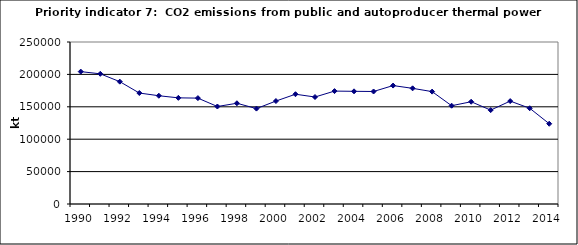
| Category | CO2 emissions from public and autoproducer thermal power stations, kt |
|---|---|
| 1990 | 204305.032 |
| 1991 | 200900.46 |
| 1992 | 188795.28 |
| 1993 | 171261.364 |
| 1994 | 167067.753 |
| 1995 | 163801.166 |
| 1996 | 163391.328 |
| 1997 | 150441.281 |
| 1998 | 155465.546 |
| 1999 | 147230.874 |
| 2000 | 158884.343 |
| 2001 | 169404.807 |
| 2002 | 165103.357 |
| 2003 | 174253.292 |
| 2004 | 173876.806 |
| 2005 | 173626.348 |
| 2006 | 182759.951 |
| 2007 | 178497.017 |
| 2008 | 173437.001 |
| 2009 | 151684.17 |
| 2010 | 157798.086 |
| 2011 | 144916.149 |
| 2012 | 158819.681 |
| 2013 | 147748.393 |
| 2014 | 123845.549 |